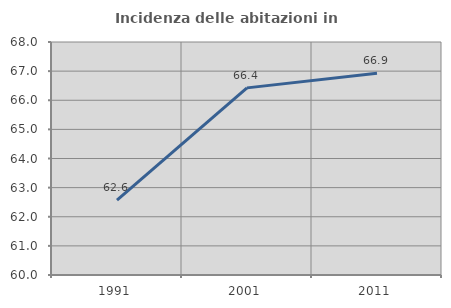
| Category | Incidenza delle abitazioni in proprietà  |
|---|---|
| 1991.0 | 62.568 |
| 2001.0 | 66.425 |
| 2011.0 | 66.93 |